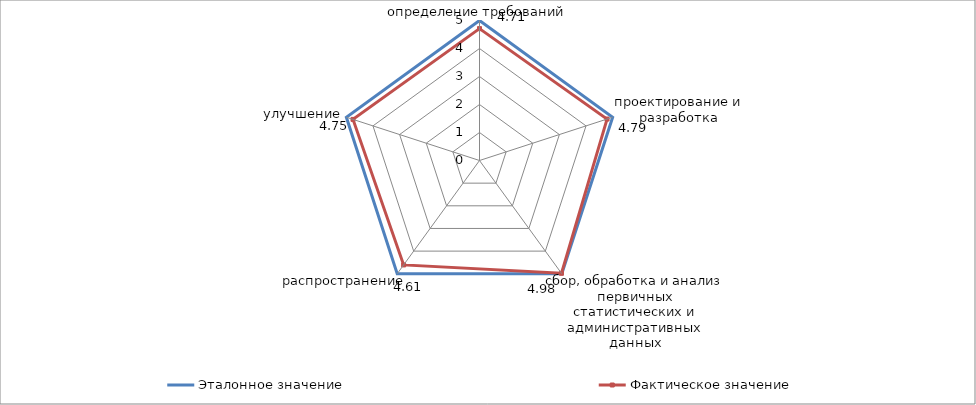
| Category | Эталонное значение | Фактическое значение |
|---|---|---|
| определение требований | 5 | 4.71 |
| проектирование и разработка | 5 | 4.79 |
| сбор, обработка и анализ первичных статистических и административных данных | 5 | 4.98 |
| распространение | 5 | 4.61 |
| улучшение | 5 | 4.75 |